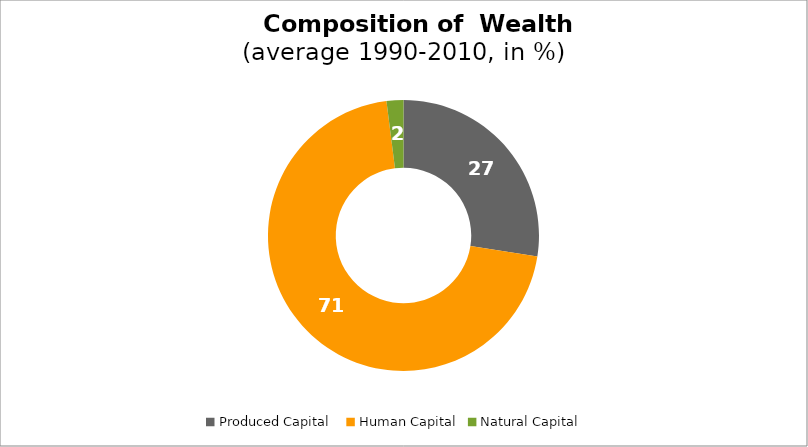
| Category | Series 0 |
|---|---|
| Produced Capital  | 27.49 |
| Human Capital | 70.5 |
| Natural Capital | 2.01 |